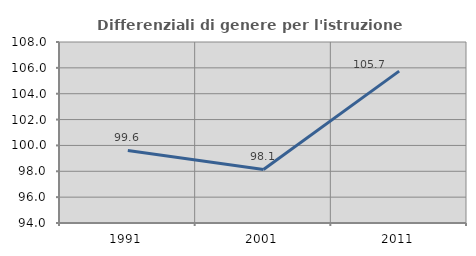
| Category | Differenziali di genere per l'istruzione superiore |
|---|---|
| 1991.0 | 99.612 |
| 2001.0 | 98.142 |
| 2011.0 | 105.747 |